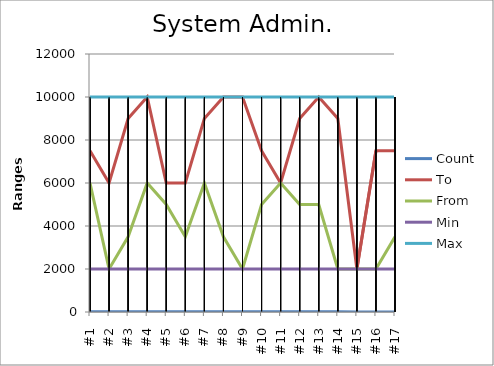
| Category | Count | To | From | Min | Max |
|---|---|---|---|---|---|
| #1 | 17 | 7500 | 6000 | 2000 | 10000 |
| #2 | 16 | 6000 | 2000 | 2000 | 10000 |
| #3 | 14 | 9000 | 3500 | 2000 | 10000 |
| #4 | 13 | 10000 | 6000 | 2000 | 10000 |
| #5 | 11 | 6000 | 5000 | 2000 | 10000 |
| #6 | 11 | 6000 | 3500 | 2000 | 10000 |
| #7 | 9 | 9000 | 6000 | 2000 | 10000 |
| #8 | 9 | 10000 | 3500 | 2000 | 10000 |
| #9 | 8 | 10000 | 2000 | 2000 | 10000 |
| #10 | 7 | 7500 | 5000 | 2000 | 10000 |
| #11 | 7 | 6000 | 6000 | 2000 | 10000 |
| #12 | 7 | 9000 | 5000 | 2000 | 10000 |
| #13 | 7 | 10000 | 5000 | 2000 | 10000 |
| #14 | 7 | 9000 | 2000 | 2000 | 10000 |
| #15 | 5 | 2000 | 2000 | 2000 | 10000 |
| #16 | 5 | 7500 | 2000 | 2000 | 10000 |
| #17 | 5 | 7500 | 3500 | 2000 | 10000 |